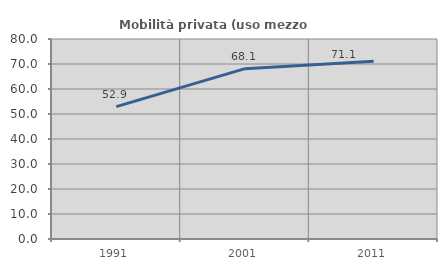
| Category | Mobilità privata (uso mezzo privato) |
|---|---|
| 1991.0 | 52.944 |
| 2001.0 | 68.129 |
| 2011.0 | 71.112 |